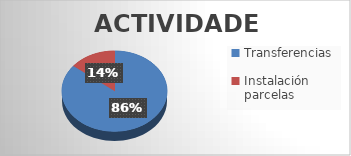
| Category | Series 0 |
|---|---|
| Transferencias | 6 |
| Instalación parcelas | 1 |